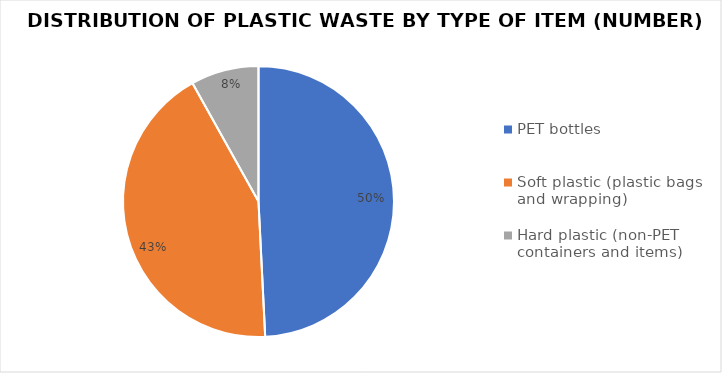
| Category | Series 0 |
|---|---|
| PET bottles | 6674 |
| Soft plastic (plastic bags and wrapping) | 5789 |
| Hard plastic (non-PET containers and items) | 1099 |